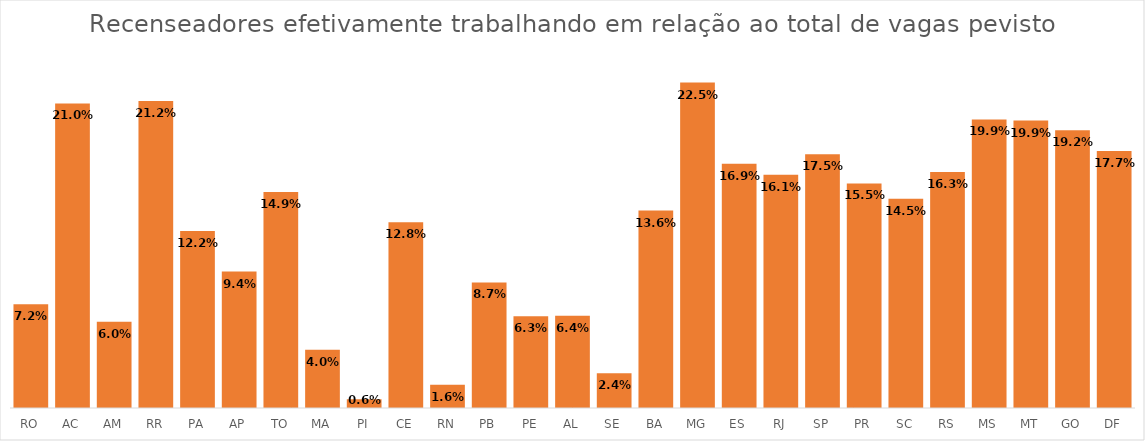
| Category | Trabalhando |
|---|---|
| RO | 0.072 |
| AC | 0.21 |
| AM | 0.06 |
| RR | 0.212 |
| PA | 0.122 |
| AP | 0.094 |
| TO | 0.149 |
| MA | 0.04 |
| PI | 0.006 |
| CE | 0.128 |
| RN | 0.016 |
| PB | 0.087 |
| PE | 0.063 |
| AL | 0.064 |
| SE | 0.024 |
| BA | 0.136 |
| MG | 0.225 |
| ES | 0.169 |
| RJ | 0.161 |
| SP | 0.175 |
| PR | 0.155 |
| SC | 0.145 |
| RS | 0.163 |
| MS | 0.199 |
| MT | 0.199 |
| GO | 0.192 |
| DF | 0.177 |